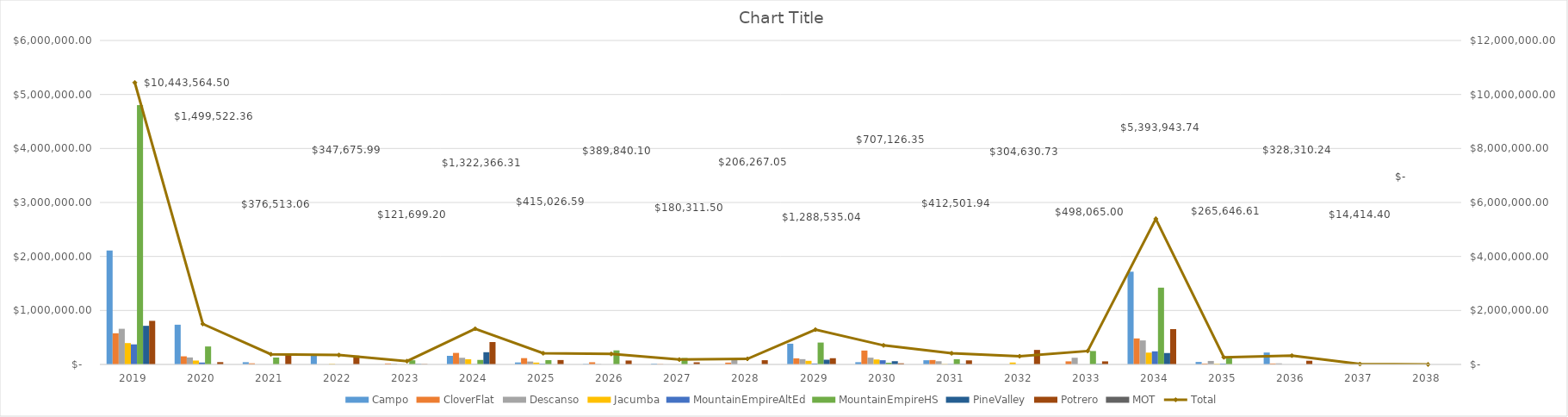
| Category | Campo | CloverFlat | Descanso | Jacumba | MountainEmpireAltEd | MountainEmpireHS | PineValley | Potrero | MOT |
|---|---|---|---|---|---|---|---|---|---|
| 2019.0 | 2111676.95 | 577407.6 | 660498 | 395744.3 | 371673.3 | 4803423.6 | 715560.6 | 807580.15 | 0 |
| 2020.0 | 735896.375 | 150467.704 | 129585.639 | 72290.55 | 35457.75 | 332976.34 | 0 | 42848 | 0 |
| 2021.0 | 41518.08 | 20860.8 | 0 | 0 | 0 | 127697.14 | 0 | 186437.04 | 0 |
| 2022.0 | 175141.2 | 0 | 0 | 9623.392 | 0 | 0 | 0 | 162911.4 | 0 |
| 2023.0 | 0 | 18396 | 10752 | 0 | 0 | 77414.4 | 8685.6 | 6451.2 | 0 |
| 2024.0 | 159298.517 | 213593.927 | 123524.95 | 96305.715 | 4809.07 | 83810.447 | 226376.062 | 414647.622 | 0 |
| 2025.0 | 36670.27 | 116979.477 | 53852.604 | 34479.6 | 12045.44 | 79437.6 | 0 | 81561.6 | 0 |
| 2026.0 | 9292.8 | 40383.75 | 7201.92 | 0 | 0 | 260301.129 | 0 | 72660.5 | 0 |
| 2027.0 | 14870.7 | 6361.2 | 0 | 0 | 0 | 119350 | 0 | 39729.6 | 0 |
| 2028.0 | 0 | 33655 | 93884.75 | 0 | 0 | 0 | 0 | 78727.3 | 0 |
| 2029.0 | 384063.355 | 112904.805 | 98140.77 | 67086.63 | 17877.34 | 405506.14 | 87470.305 | 115485.695 | 0 |
| 2030.0 | 41331.745 | 257195.6 | 125475.924 | 92321.95 | 77991.2 | 31726.485 | 60202.45 | 20881 | 0 |
| 2031.0 | 77928 | 81926.4 | 59633.28 | 6364.8 | 6099.6 | 96886.4 | 8101.86 | 75561.6 | 0 |
| 2032.0 | 0 | 0 | 0 | 35582.332 | 0 | 0 | 0 | 269048.4 | 0 |
| 2033.0 | 0 | 57318.3 | 123980.2 | 0 | 0 | 248500 | 11012.1 | 57254.4 | 0 |
| 2034.0 | 1718064.473 | 481677.82 | 444902.195 | 219044.685 | 242673.885 | 1422216.478 | 211220.413 | 654143.793 | 0 |
| 2035.0 | 45993.22 | 16901.822 | 64669.044 | 12007.24 | 15107.84 | 110967.44 | 0 | 0 | 0 |
| 2036.0 | 220894.88 | 18120 | 20584.32 | 0 | 0 | 0 | 0 | 68711.04 | 0 |
| 2037.0 | 0 | 0 | 0 | 14414.4 | 0 | 0 | 0 | 0 | 0 |
| 2038.0 | 0 | 0 | 0 | 0 | 0 | 0 | 0 | 0 | 0 |